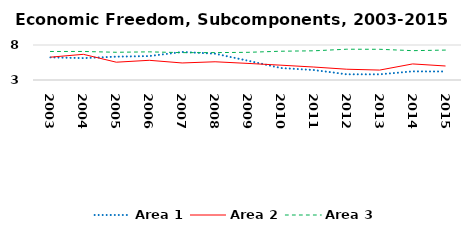
| Category | Area 1 | Area 2 | Area 3 |
|---|---|---|---|
| 2003.0 | 6.23 | 6.263 | 7.074 |
| 2004.0 | 6.127 | 6.669 | 7.078 |
| 2005.0 | 6.334 | 5.543 | 6.961 |
| 2006.0 | 6.416 | 5.814 | 7.02 |
| 2007.0 | 7.005 | 5.433 | 6.909 |
| 2008.0 | 6.76 | 5.603 | 6.913 |
| 2009.0 | 5.754 | 5.368 | 6.954 |
| 2010.0 | 4.709 | 5.116 | 7.111 |
| 2011.0 | 4.423 | 4.851 | 7.171 |
| 2012.0 | 3.816 | 4.538 | 7.398 |
| 2013.0 | 3.811 | 4.419 | 7.388 |
| 2014.0 | 4.231 | 5.296 | 7.19 |
| 2015.0 | 4.216 | 5.001 | 7.274 |